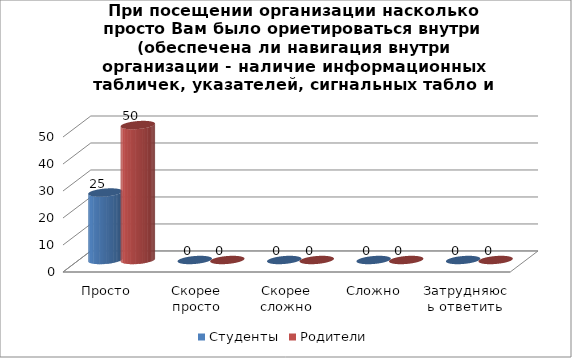
| Category | Студенты | Родители |
|---|---|---|
| Просто | 25 | 50 |
| Скорее просто | 0 | 0 |
| Скорее сложно | 0 | 0 |
| Сложно | 0 | 0 |
| Затрудняюсь ответить | 0 | 0 |